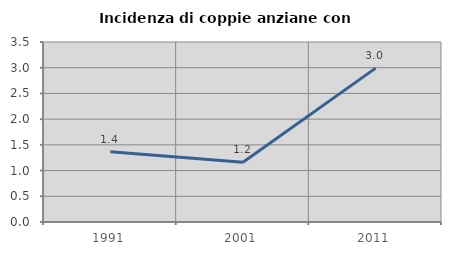
| Category | Incidenza di coppie anziane con figli |
|---|---|
| 1991.0 | 1.366 |
| 2001.0 | 1.16 |
| 2011.0 | 2.992 |